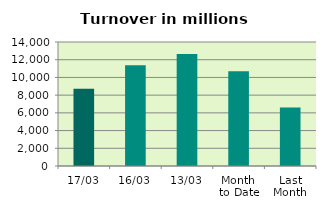
| Category | Series 0 |
|---|---|
| 17/03 | 8734.146 |
| 16/03 | 11386.613 |
| 13/03 | 12651.836 |
| Month 
to Date | 10684.481 |
| Last
Month | 6605.047 |